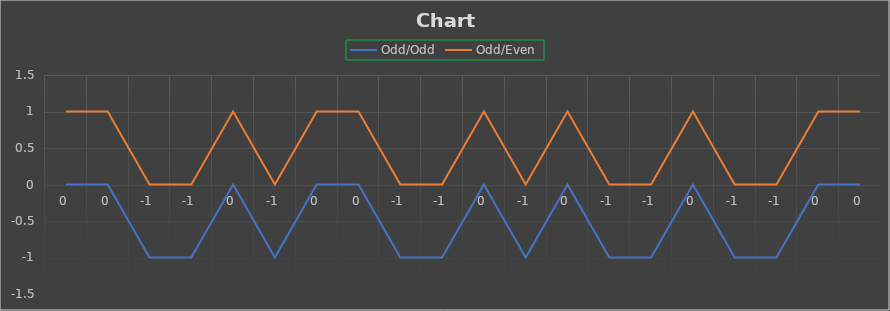
| Category | Odd/Odd | Odd/Even |
|---|---|---|
| 0.0 | 0 | 1 |
| 0.0 | 0 | 1 |
| -1.0 | -1 | 0 |
| -1.0 | -1 | 0 |
| 0.0 | 0 | 1 |
| -1.0 | -1 | 0 |
| 0.0 | 0 | 1 |
| 0.0 | 0 | 1 |
| -1.0 | -1 | 0 |
| -1.0 | -1 | 0 |
| 0.0 | 0 | 1 |
| -1.0 | -1 | 0 |
| 0.0 | 0 | 1 |
| -1.0 | -1 | 0 |
| -1.0 | -1 | 0 |
| 0.0 | 0 | 1 |
| -1.0 | -1 | 0 |
| -1.0 | -1 | 0 |
| 0.0 | 0 | 1 |
| 0.0 | 0 | 1 |